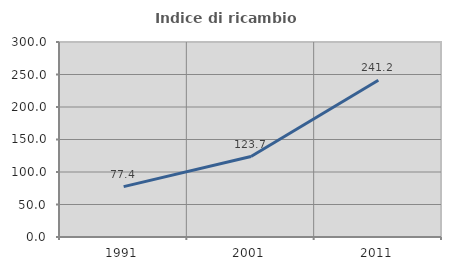
| Category | Indice di ricambio occupazionale  |
|---|---|
| 1991.0 | 77.443 |
| 2001.0 | 123.72 |
| 2011.0 | 241.22 |